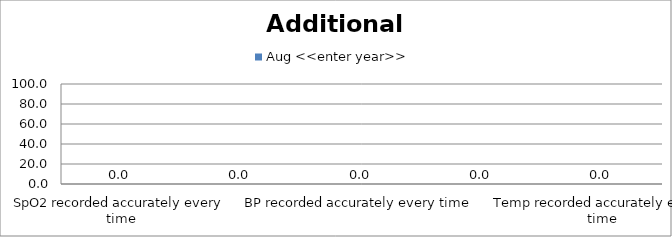
| Category | Aug <<enter year>> |
|---|---|
| SpO2 recorded accurately every time | 0 |
| CRT recorded accurately every time | 0 |
| BP recorded accurately every time | 0 |
| Skin Colour recorded accurately every time | 0 |
| Temp recorded accurately every time | 0 |